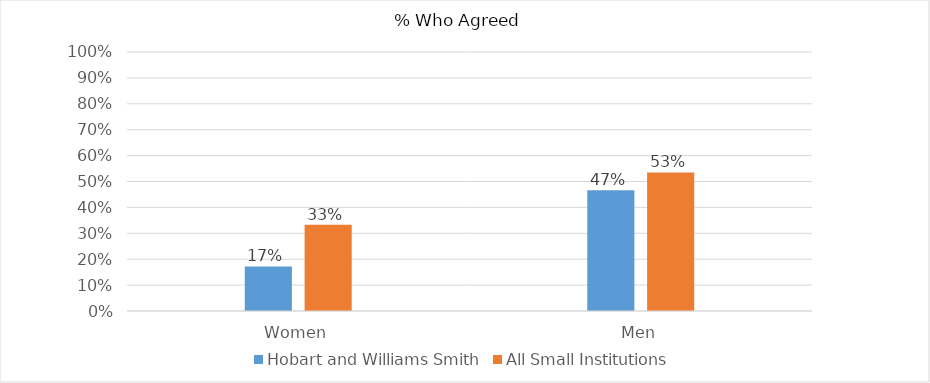
| Category | Hobart and Williams Smith | All Small Institutions |
|---|---|---|
| Women | 0.172 | 0.333 |
| Men | 0.467 | 0.535 |